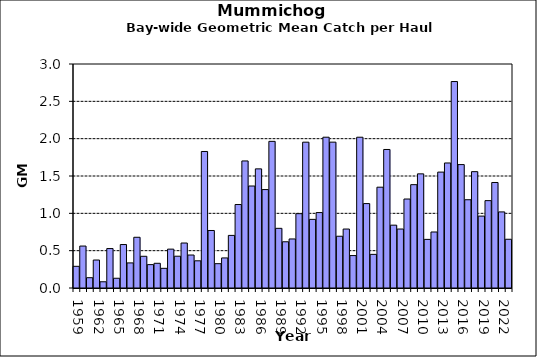
| Category | Series 0 |
|---|---|
| 1959.0 | 0.29 |
| 1960.0 | 0.562 |
| 1961.0 | 0.138 |
| 1962.0 | 0.375 |
| 1963.0 | 0.083 |
| 1964.0 | 0.528 |
| 1965.0 | 0.13 |
| 1966.0 | 0.582 |
| 1967.0 | 0.336 |
| 1968.0 | 0.679 |
| 1969.0 | 0.425 |
| 1970.0 | 0.313 |
| 1971.0 | 0.331 |
| 1972.0 | 0.263 |
| 1973.0 | 0.52 |
| 1974.0 | 0.426 |
| 1975.0 | 0.602 |
| 1976.0 | 0.442 |
| 1977.0 | 0.364 |
| 1978.0 | 1.828 |
| 1979.0 | 0.77 |
| 1980.0 | 0.326 |
| 1981.0 | 0.403 |
| 1982.0 | 0.704 |
| 1983.0 | 1.118 |
| 1984.0 | 1.702 |
| 1985.0 | 1.366 |
| 1986.0 | 1.596 |
| 1987.0 | 1.318 |
| 1988.0 | 1.964 |
| 1989.0 | 0.799 |
| 1990.0 | 0.619 |
| 1991.0 | 0.657 |
| 1992.0 | 0.995 |
| 1993.0 | 1.953 |
| 1994.0 | 0.919 |
| 1995.0 | 1.01 |
| 1996.0 | 2.02 |
| 1997.0 | 1.953 |
| 1998.0 | 0.693 |
| 1999.0 | 0.79 |
| 2000.0 | 0.434 |
| 2001.0 | 2.019 |
| 2002.0 | 1.131 |
| 2003.0 | 0.451 |
| 2004.0 | 1.35 |
| 2005.0 | 1.855 |
| 2006.0 | 0.842 |
| 2007.0 | 0.79 |
| 2008.0 | 1.192 |
| 2009.0 | 1.384 |
| 2010.0 | 1.529 |
| 2011.0 | 0.651 |
| 2012.0 | 0.75 |
| 2013.0 | 1.552 |
| 2014.0 | 1.674 |
| 2015.0 | 2.765 |
| 2016.0 | 1.653 |
| 2017.0 | 1.182 |
| 2018.0 | 1.558 |
| 2019.0 | 0.963 |
| 2020.0 | 1.17 |
| 2021.0 | 1.413 |
| 2022.0 | 1.019 |
| 2023.0 | 0.653 |